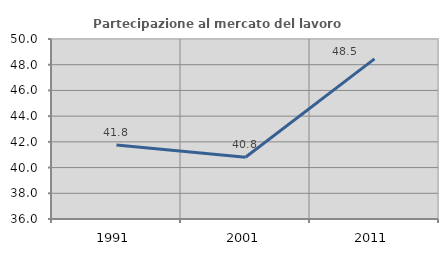
| Category | Partecipazione al mercato del lavoro  femminile |
|---|---|
| 1991.0 | 41.756 |
| 2001.0 | 40.8 |
| 2011.0 | 48.45 |